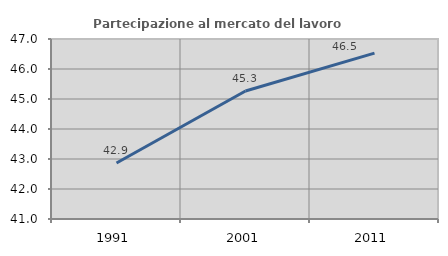
| Category | Partecipazione al mercato del lavoro  femminile |
|---|---|
| 1991.0 | 42.867 |
| 2001.0 | 45.266 |
| 2011.0 | 46.529 |